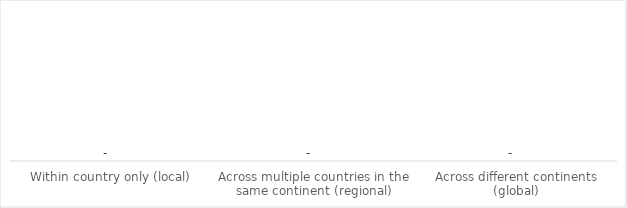
| Category | Series 0 |
|---|---|
| Within country only (local) | 0 |
| Across multiple countries in the same continent (regional) | 0 |
| Across different continents (global) | 0 |